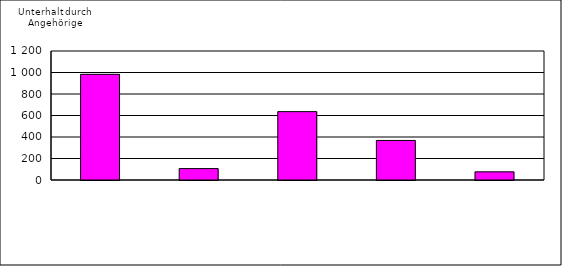
| Category | Series 0 |
|---|---|
| 0 | 983 |
| 1 | 106 |
| 2 | 636 |
| 3 | 368 |
| 4 | 76 |